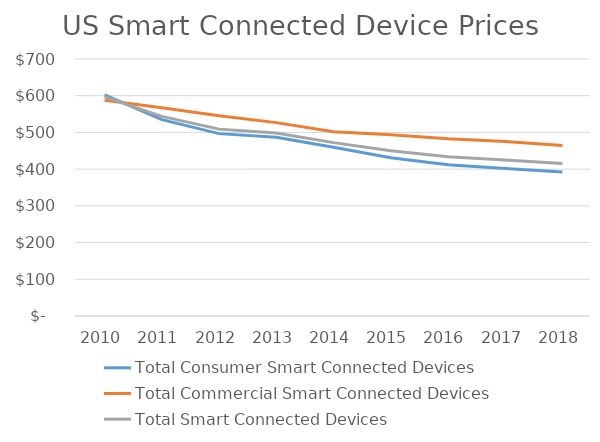
| Category | Total Consumer Smart Connected Devices | Total Commercial Smart Connected Devices | Total Smart Connected Devices |
|---|---|---|---|
| 2010.0 | 602.5 | 587.9 | 596.8 |
| 2011.0 | 534.74 | 567.4 | 543.61 |
| 2012.0 | 496.73 | 545.43 | 508.99 |
| 2013.0 | 486.92 | 526.73 | 498.46 |
| 2014.0 | 459.61 | 501.87 | 472.18 |
| 2015.0 | 430.94 | 493.96 | 450.05 |
| 2016.0 | 412.06 | 482.8 | 433.85 |
| 2017.0 | 401.99 | 475.53 | 424.9 |
| 2018.0 | 392.48 | 464.4 | 415.27 |